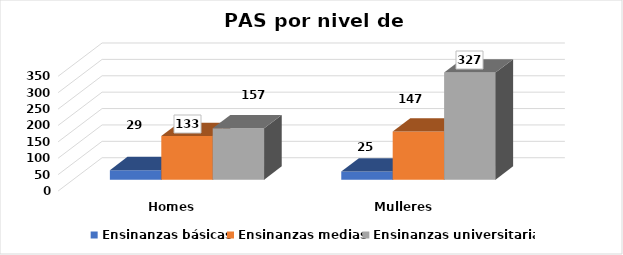
| Category | Ensinanzas básicas | Ensinanzas medias | Ensinanzas universitarias |
|---|---|---|---|
| Homes | 29 | 133 | 157 |
| Mulleres | 25 | 147 | 327 |